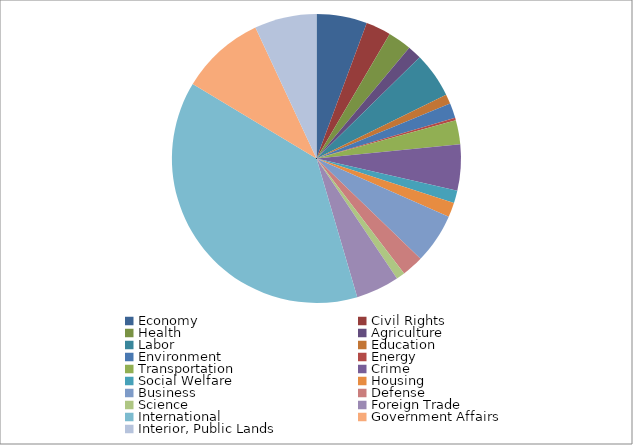
| Category | Series 0 |
|---|---|
| Economy | 5.654 |
| Civil Rights | 2.8 |
| Health | 2.639 |
| Agriculture | 1.562 |
| Labor | 5.062 |
| Education | 1.077 |
| Environment | 1.669 |
| Energy | 0.269 |
| Transportation | 2.693 |
| Crime | 5.17 |
| Social Welfare | 1.4 |
| Housing | 1.616 |
| Business | 5.6 |
| Defense | 2.423 |
| Science | 0.969 |
| Foreign Trade | 4.847 |
| International | 38.18 |
| Government Affairs | 9.424 |
| Interior, Public Lands | 6.947 |